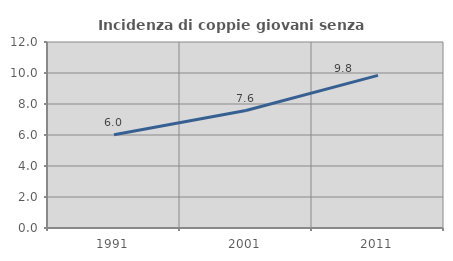
| Category | Incidenza di coppie giovani senza figli |
|---|---|
| 1991.0 | 6.02 |
| 2001.0 | 7.58 |
| 2011.0 | 9.847 |